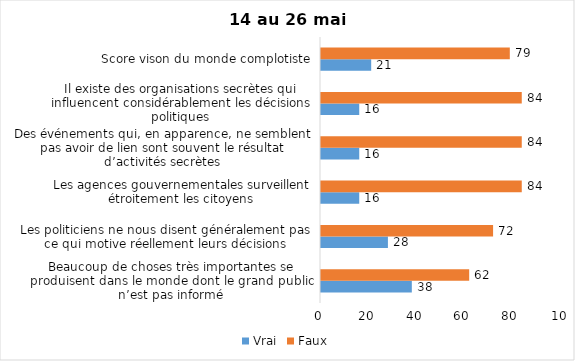
| Category | Vrai | Faux |
|---|---|---|
| Beaucoup de choses très importantes se produisent dans le monde dont le grand public n’est pas informé | 38 | 62 |
| Les politiciens ne nous disent généralement pas ce qui motive réellement leurs décisions | 28 | 72 |
| Les agences gouvernementales surveillent étroitement les citoyens | 16 | 84 |
| Des événements qui, en apparence, ne semblent pas avoir de lien sont souvent le résultat d’activités secrètes | 16 | 84 |
| Il existe des organisations secrètes qui influencent considérablement les décisions politiques | 16 | 84 |
| Score vison du monde complotiste | 21 | 79 |